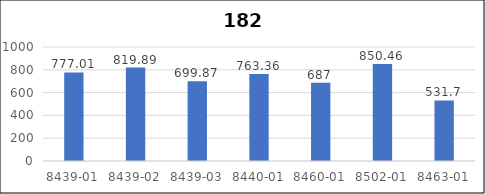
| Category | Series 0 |
|---|---|
| 8439-01 | 777.01 |
| 8439-02 | 819.89 |
| 8439-03 | 699.87 |
| 8440-01 | 763.36 |
| 8460-01 | 687 |
| 8502-01 | 850.46 |
| 8463-01 | 531.7 |